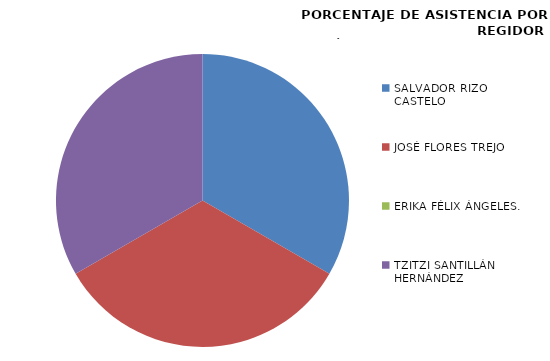
| Category | Series 0 |
|---|---|
| SALVADOR RIZO CASTELO | 100 |
| JOSÉ FLORES TREJO | 100 |
| ERIKA FÉLIX ÁNGELES. | 0 |
| TZITZI SANTILLÁN HERNÁNDEZ | 100 |